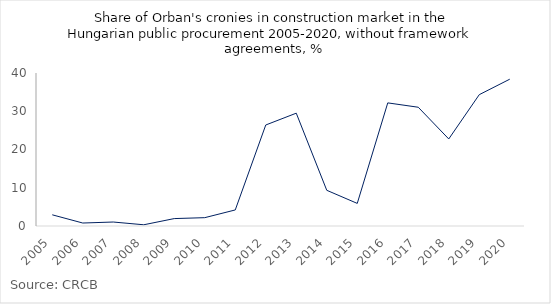
| Category | mgts_plus |
|---|---|
| 2005.0 | 2.927 |
| 2006.0 | 0.78 |
| 2007.0 | 1.038 |
| 2008.0 | 0.321 |
| 2009.0 | 1.937 |
| 2010.0 | 2.178 |
| 2011.0 | 4.196 |
| 2012.0 | 26.405 |
| 2013.0 | 29.497 |
| 2014.0 | 9.338 |
| 2015.0 | 5.91 |
| 2016.0 | 32.189 |
| 2017.0 | 31.05 |
| 2018.0 | 22.755 |
| 2019.0 | 34.336 |
| 2020.0 | 38.379 |